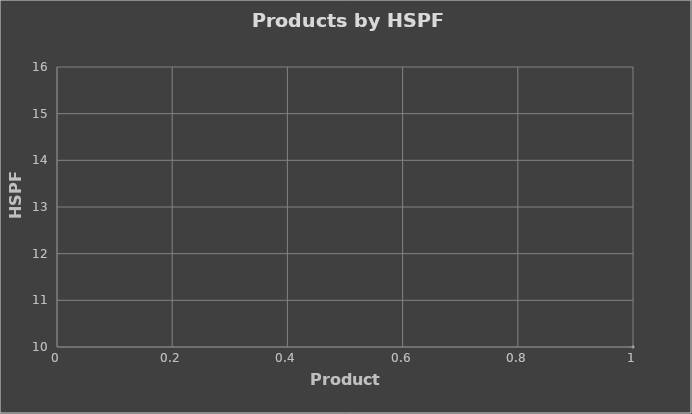
| Category | Series 0 |
|---|---|
| 0 | 10 |
| 1 | 10 |
| 2 | 10 |
| 3 | 10 |
| 4 | 10 |
| 5 | 10 |
| 6 | 10 |
| 7 | 10 |
| 8 | 10 |
| 9 | 10 |
| 10 | 10 |
| 11 | 10 |
| 12 | 10 |
| 13 | 10 |
| 14 | 10 |
| 15 | 10 |
| 16 | 10 |
| 17 | 10 |
| 18 | 10 |
| 19 | 10 |
| 20 | 10 |
| 21 | 10 |
| 22 | 10 |
| 23 | 10 |
| 24 | 10 |
| 25 | 10 |
| 26 | 10 |
| 27 | 10 |
| 28 | 10 |
| 29 | 13 |
| 30 | 12 |
| 31 | 11.6 |
| 32 | 11.3 |
| 33 | 13.5 |
| 34 | 12.5 |
| 35 | 13.5 |
| 36 | 12.5 |
| 37 | 12.5 |
| 38 | 11.5 |
| 39 | 12 |
| 40 | 11 |
| 41 | 12 |
| 42 | 11 |
| 43 | 12.8 |
| 44 | 12.5 |
| 45 | 11.7 |
| 46 | 11.2 |
| 47 | 10 |
| 48 | 10 |
| 49 | 10 |
| 50 | 11 |
| 51 | 11.3 |
| 52 | 10.7 |
| 53 | 11 |
| 54 | 10.5 |
| 55 | 10.5 |
| 56 | 11.5 |
| 57 | 11 |
| 58 | 11.7 |
| 59 | 11.4 |
| 60 | 11.2 |
| 61 | 10.4 |
| 62 | 10.4 |
| 63 | 10 |
| 64 | 11 |
| 65 | 10 |
| 66 | 10 |
| 67 | 14.5 |
| 68 | 13.6 |
| 69 | 10.5 |
| 70 | 11 |
| 71 | 12 |
| 72 | 10.5 |
| 73 | 10 |
| 74 | 10 |
| 75 | 10 |
| 76 | 10 |
| 77 | 12 |
| 78 | 10.5 |
| 79 | 10.5 |
| 80 | 10.5 |
| 81 | 10.5 |
| 82 | 10.5 |
| 83 | 11 |
| 84 | 11 |
| 85 | 11 |
| 86 | 11 |
| 87 | 11 |
| 88 | 11.5 |
| 89 | 11.5 |
| 90 | 11 |
| 91 | 11.5 |
| 92 | 11.5 |
| 93 | 10 |
| 94 | 10 |
| 95 | 10 |
| 96 | 10.5 |
| 97 | 10.5 |
| 98 | 10.5 |
| 99 | 10.5 |
| 100 | 10.5 |
| 101 | 10.5 |
| 102 | 11 |
| 103 | 11 |
| 104 | 11 |
| 105 | 10.5 |
| 106 | 10.5 |
| 107 | 10.5 |
| 108 | 10.5 |
| 109 | 10.5 |
| 110 | 11 |
| 111 | 11 |
| 112 | 11 |
| 113 | 11 |
| 114 | 11 |
| 115 | 11 |
| 116 | 11 |
| 117 | 11 |
| 118 | 11 |
| 119 | 11 |
| 120 | 11 |
| 121 | 11 |
| 122 | 11 |
| 123 | 11 |
| 124 | 11 |
| 125 | 11 |
| 126 | 11.5 |
| 127 | 11.5 |
| 128 | 11.5 |
| 129 | 11.5 |
| 130 | 11.5 |
| 131 | 11.5 |
| 132 | 11.5 |
| 133 | 11.5 |
| 134 | 11.5 |
| 135 | 11.5 |
| 136 | 11.5 |
| 137 | 11.5 |
| 138 | 10.5 |
| 139 | 10.5 |
| 140 | 10.5 |
| 141 | 10.5 |
| 142 | 10.5 |
| 143 | 10.5 |
| 144 | 11 |
| 145 | 11 |
| 146 | 11 |
| 147 | 11 |
| 148 | 11 |
| 149 | 11 |
| 150 | 10.5 |
| 151 | 10.5 |
| 152 | 10.5 |
| 153 | 10.5 |
| 154 | 11 |
| 155 | 11 |
| 156 | 11 |
| 157 | 11 |
| 158 | 11 |
| 159 | 11 |
| 160 | 11 |
| 161 | 13 |
| 162 | 10.5 |
| 163 | 10.5 |
| 164 | 11.5 |
| 165 | 11 |
| 166 | 11.5 |
| 167 | 11.5 |
| 168 | 11.5 |
| 169 | 11.5 |
| 170 | 11 |
| 171 | 11 |
| 172 | 11 |
| 173 | 10.5 |
| 174 | 10.5 |
| 175 | 11 |
| 176 | 11 |
| 177 | 11 |
| 178 | 11 |
| 179 | 11 |
| 180 | 11.5 |
| 181 | 10.5 |
| 182 | 10.5 |
| 183 | 10.5 |
| 184 | 10.5 |
| 185 | 11 |
| 186 | 11 |
| 187 | 10.5 |
| 188 | 11 |
| 189 | 11 |
| 190 | 11 |
| 191 | 11.5 |
| 192 | 11.5 |
| 193 | 11.5 |
| 194 | 11.5 |
| 195 | 11.5 |
| 196 | 11 |
| 197 | 11.5 |
| 198 | 11.5 |
| 199 | 11 |
| 200 | 11.5 |
| 201 | 11.5 |
| 202 | 10.5 |
| 203 | 10.5 |
| 204 | 11 |
| 205 | 11 |
| 206 | 11 |
| 207 | 11 |
| 208 | 11 |
| 209 | 11 |
| 210 | 10.5 |
| 211 | 11 |
| 212 | 11 |
| 213 | 10.5 |
| 214 | 10.5 |
| 215 | 10.5 |
| 216 | 11 |
| 217 | 11 |
| 218 | 10.5 |
| 219 | 11 |
| 220 | 11 |
| 221 | 11 |
| 222 | 11.5 |
| 223 | 11.5 |
| 224 | 12 |
| 225 | 11 |
| 226 | 10.5 |
| 227 | 11 |
| 228 | 11 |
| 229 | 10.5 |
| 230 | 10.5 |
| 231 | 10.5 |
| 232 | 12 |
| 233 | 15 |
| 234 | 14 |
| 235 | 12 |
| 236 | 13 |
| 237 | 12.5 |
| 238 | 13 |
| 239 | 10.3 |
| 240 | 12 |
| 241 | 11.2 |
| 242 | 10.5 |
| 243 | 10.5 |
| 244 | 10.5 |
| 245 | 10.3 |
| 246 | 10.3 |
| 247 | 10.5 |
| 248 | 10.5 |
| 249 | 10.2 |
| 250 | 10.2 |
| 251 | 10 |
| 252 | 10 |
| 253 | 10 |
| 254 | 10 |
| 255 | 12 |
| 256 | 10.5 |
| 257 | 10.5 |
| 258 | 10.5 |
| 259 | 10.5 |
| 260 | 10.5 |
| 261 | 11 |
| 262 | 11 |
| 263 | 11 |
| 264 | 11 |
| 265 | 11 |
| 266 | 11.5 |
| 267 | 11.5 |
| 268 | 11 |
| 269 | 11.5 |
| 270 | 11.5 |
| 271 | 10 |
| 272 | 10 |
| 273 | 10 |
| 274 | 10.5 |
| 275 | 10.5 |
| 276 | 10.5 |
| 277 | 10.5 |
| 278 | 10.5 |
| 279 | 10.5 |
| 280 | 11 |
| 281 | 11 |
| 282 | 11 |
| 283 | 10.5 |
| 284 | 10.5 |
| 285 | 10.5 |
| 286 | 10.5 |
| 287 | 10.5 |
| 288 | 11 |
| 289 | 11 |
| 290 | 11 |
| 291 | 11 |
| 292 | 11 |
| 293 | 11 |
| 294 | 11 |
| 295 | 11 |
| 296 | 11 |
| 297 | 11 |
| 298 | 11 |
| 299 | 11 |
| 300 | 11 |
| 301 | 11 |
| 302 | 11 |
| 303 | 11 |
| 304 | 11.5 |
| 305 | 11.5 |
| 306 | 11.5 |
| 307 | 11.5 |
| 308 | 11.5 |
| 309 | 11.5 |
| 310 | 11.5 |
| 311 | 11.5 |
| 312 | 11.5 |
| 313 | 11.5 |
| 314 | 11.5 |
| 315 | 11.5 |
| 316 | 10.5 |
| 317 | 10.5 |
| 318 | 10.5 |
| 319 | 10.5 |
| 320 | 10.5 |
| 321 | 10.5 |
| 322 | 11 |
| 323 | 11 |
| 324 | 11 |
| 325 | 11 |
| 326 | 11 |
| 327 | 11 |
| 328 | 10.5 |
| 329 | 10.5 |
| 330 | 10.5 |
| 331 | 10.5 |
| 332 | 11 |
| 333 | 11 |
| 334 | 11 |
| 335 | 11 |
| 336 | 11 |
| 337 | 11 |
| 338 | 11 |
| 339 | 11 |
| 340 | 13 |
| 341 | 10.5 |
| 342 | 10.5 |
| 343 | 11.5 |
| 344 | 11 |
| 345 | 11.5 |
| 346 | 11.5 |
| 347 | 11.5 |
| 348 | 11.5 |
| 349 | 11 |
| 350 | 11 |
| 351 | 11 |
| 352 | 10.5 |
| 353 | 10.5 |
| 354 | 11 |
| 355 | 11 |
| 356 | 11 |
| 357 | 11 |
| 358 | 11 |
| 359 | 11.5 |
| 360 | 10.5 |
| 361 | 10.5 |
| 362 | 10.5 |
| 363 | 10.5 |
| 364 | 11 |
| 365 | 11 |
| 366 | 10.5 |
| 367 | 11 |
| 368 | 11 |
| 369 | 11 |
| 370 | 11.5 |
| 371 | 11.5 |
| 372 | 11.5 |
| 373 | 11.5 |
| 374 | 11.5 |
| 375 | 11 |
| 376 | 11.5 |
| 377 | 11.5 |
| 378 | 11 |
| 379 | 11.5 |
| 380 | 11.5 |
| 381 | 10.5 |
| 382 | 10.5 |
| 383 | 11 |
| 384 | 11 |
| 385 | 11 |
| 386 | 11 |
| 387 | 11 |
| 388 | 11 |
| 389 | 10.5 |
| 390 | 11 |
| 391 | 11 |
| 392 | 10.5 |
| 393 | 10.5 |
| 394 | 10.5 |
| 395 | 11 |
| 396 | 11 |
| 397 | 10.5 |
| 398 | 11 |
| 399 | 11 |
| 400 | 11 |
| 401 | 11.5 |
| 402 | 11.5 |
| 403 | 12 |
| 404 | 11 |
| 405 | 10.5 |
| 406 | 11 |
| 407 | 11 |
| 408 | 10.5 |
| 409 | 10.5 |
| 410 | 10.5 |
| 411 | 12 |
| 412 | 11 |
| 413 | 12.5 |
| 414 | 10.5 |
| 415 | 15 |
| 416 | 14 |
| 417 | 10.3 |
| 418 | 10.3 |
| 419 | 10.3 |
| 420 | 11.2 |
| 421 | 12 |
| 422 | 10.3 |
| 423 | 10.5 |
| 424 | 14.5 |
| 425 | 13.6 |
| 426 | 10.5 |
| 427 | 11 |
| 428 | 12 |
| 429 | 11 |
| 430 | 10.55 |
| 431 | 10 |
| 432 | 12.5 |
| 433 | 12.5 |
| 434 | 11.6 |
| 435 | 11 |
| 436 | 10.6 |
| 437 | 10.7 |
| 438 | 12.5 |
| 439 | 12.5 |
| 440 | 11.3 |
| 441 | 12 |
| 442 | 11.7 |
| 443 | 12.5 |
| 444 | 10.3 |
| 445 | 12.5 |
| 446 | 11.7 |
| 447 | 11.2 |
| 448 | 11 |
| 449 | 10.1 |
| 450 | 10 |
| 451 | 10 |
| 452 | 10 |
| 453 | 10 |
| 454 | 10 |
| 455 | 14.5 |
| 456 | 13.6 |
| 457 | 10.5 |
| 458 | 11 |
| 459 | 12 |
| 460 | 10.5 |
| 461 | 11.2 |
| 462 | 10 |
| 463 | 10 |
| 464 | 10.5 |
| 465 | 10.1 |
| 466 | 10 |